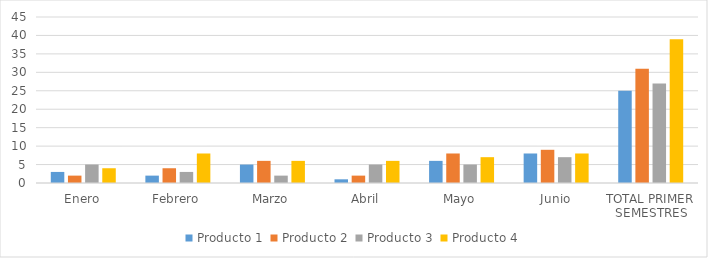
| Category | Producto 1 | Producto 2 | Producto 3 | Producto 4 |
|---|---|---|---|---|
| Enero | 3 | 2 | 5 | 4 |
| Febrero | 2 | 4 | 3 | 8 |
| Marzo | 5 | 6 | 2 | 6 |
| Abril | 1 | 2 | 5 | 6 |
| Mayo | 6 | 8 | 5 | 7 |
| Junio | 8 | 9 | 7 | 8 |
| TOTAL PRIMER SEMESTRES | 25 | 31 | 27 | 39 |